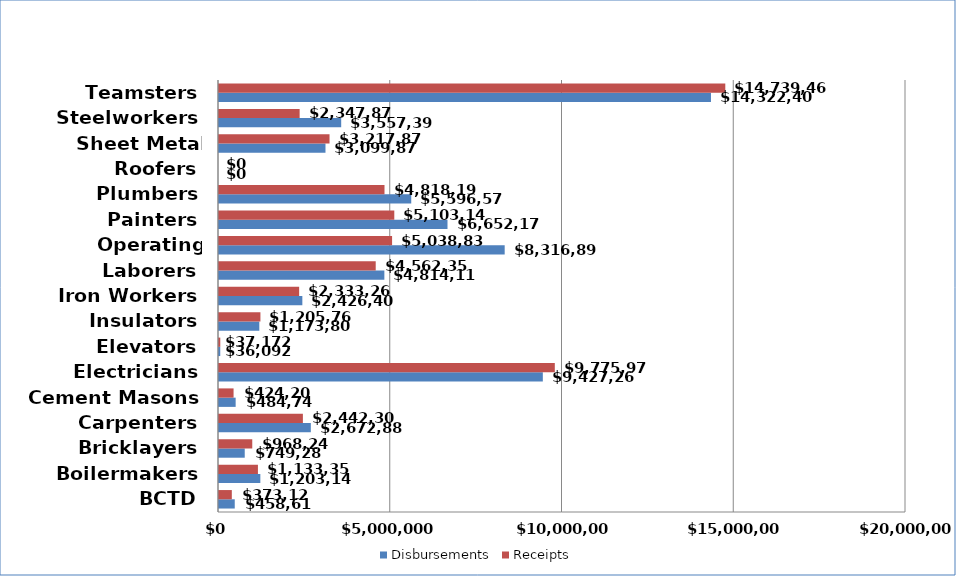
| Category | Disbursements | Receipts |
|---|---|---|
| BCTD | 458613 | 373129 |
| Boilermakers | 1203141 | 1133350 |
| Bricklayers | 749281 | 968243 |
| Carpenters | 2672885 | 2442309 |
| Cement Masons | 484748 | 424200 |
| Electricians | 9427268 | 9775979 |
| Elevators | 36092 | 37172 |
| Insulators | 1173803 | 1205766 |
| Iron Workers | 2426407 | 2333260 |
| Laborers | 4814114 | 4562352 |
| Operating Engineers | 8316895 | 5038839 |
| Painters | 6652174 | 5103145 |
| Plumbers | 5596575 | 4818194 |
| Roofers | 0 | 0 |
| Sheet Metal Workers | 3099878 | 3217877 |
| Steelworkers | 3557399 | 2347873 |
| Teamsters | 14322400 | 14739465 |